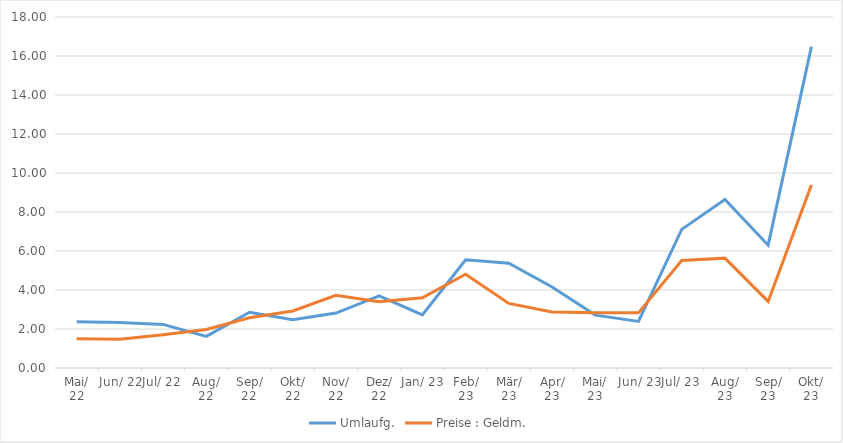
| Category | Umlaufg. | Preise : Geldm. |
|---|---|---|
| 1922-05-07 | 2.373 | 1.504 |
| 1922-06-06 12:00:00 | 2.327 | 1.475 |
| 1922-07-07 | 2.236 | 1.706 |
| 1922-08-06 12:00:00 | 1.623 | 1.974 |
| 1922-09-06 | 2.861 | 2.575 |
| 1922-10-06 12:00:00 | 2.472 | 2.927 |
| 1922-11-06 | 2.816 | 3.727 |
| 1922-12-06 12:00:00 | 3.703 | 3.401 |
| 1923-01-06 | 2.722 | 3.602 |
| 1923-02-05 12:00:00 | 5.553 | 4.805 |
| 1923-03-08 | 5.37 | 3.31 |
| 1923-04-07 12:00:00 | 4.154 | 2.876 |
| 1923-05-08 | 2.712 | 2.838 |
| 1923-06-07 12:00:00 | 2.388 | 2.828 |
| 1923-07-08 | 7.108 | 5.515 |
| 1923-08-07 12:00:00 | 8.638 | 5.634 |
| 1923-09-07 | 6.298 | 3.414 |
| 1923-10-07 12:00:00 | 16.478 | 9.386 |